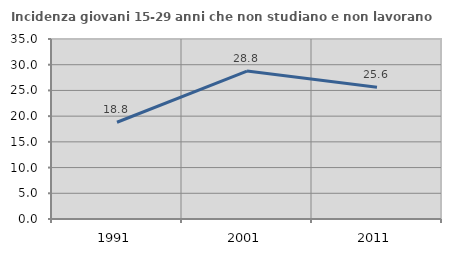
| Category | Incidenza giovani 15-29 anni che non studiano e non lavorano  |
|---|---|
| 1991.0 | 18.81 |
| 2001.0 | 28.768 |
| 2011.0 | 25.604 |